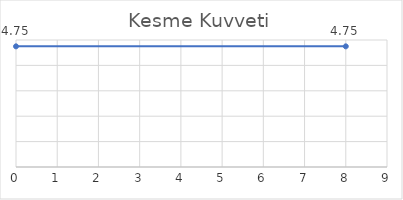
| Category | Series 0 |
|---|---|
| 0.0 | 4.75 |
| 8.0 | 4.75 |